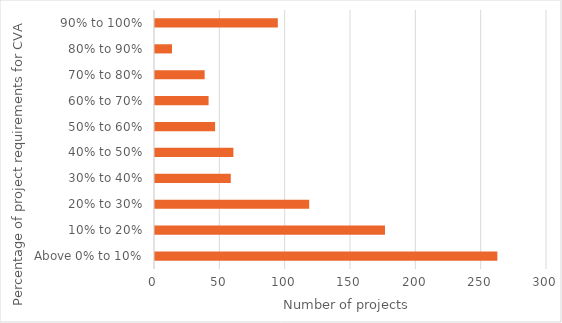
| Category | Number of projects |
|---|---|
| Above 0% to 10% | 262 |
| 10% to 20% | 176 |
| 20% to 30% | 118 |
| 30% to 40% | 58 |
| 40% to 50% | 60 |
| 50% to 60% | 46 |
| 60% to 70% | 41 |
| 70% to 80% | 38 |
| 80% to 90% | 13 |
| 90% to 100% | 94 |